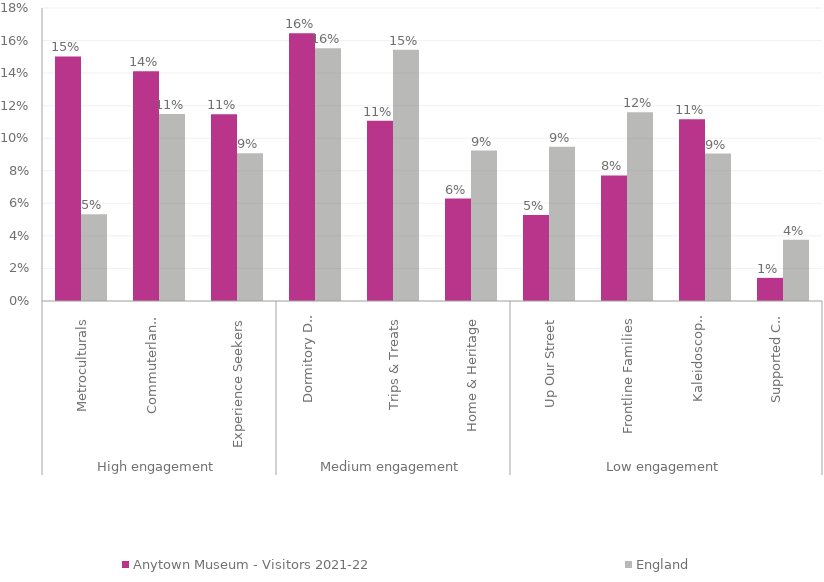
| Category | Anytown Museum - Visitors 2021-22 | England |
|---|---|---|
| 0 | 0.15 | 0.053 |
| 1 | 0.141 | 0.115 |
| 2 | 0.115 | 0.091 |
| 3 | 0.164 | 0.155 |
| 4 | 0.111 | 0.154 |
| 5 | 0.063 | 0.092 |
| 6 | 0.053 | 0.095 |
| 7 | 0.077 | 0.116 |
| 8 | 0.112 | 0.091 |
| 9 | 0.014 | 0.038 |